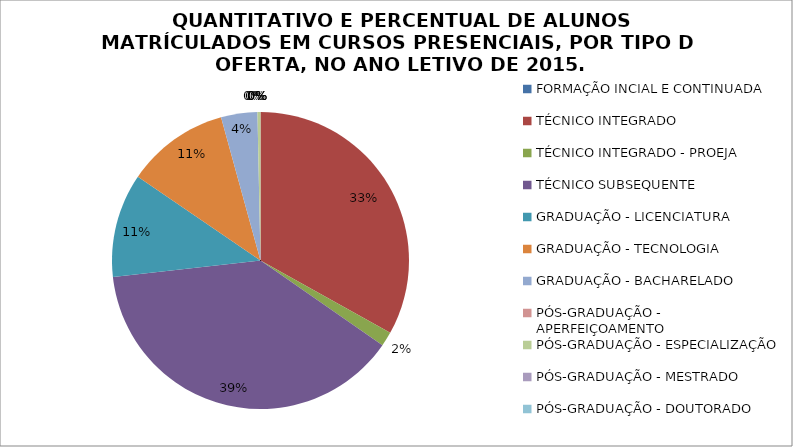
| Category | QUANTITATIVO E PERCENTUAL DE ALUNOS MATRÍCULADOS EM CURSOS PRESENCIAIS, POR TIPO DE OFERTA, NO ANO LETIVO DE 2015. |
|---|---|
| FORMAÇÃO INCIAL E CONTINUADA | 0 |
| TÉCNICO INTEGRADO | 33.099 |
| TÉCNICO INTEGRADO - PROEJA | 1.572 |
| TÉCNICO SUBSEQUENTE | 38.564 |
| GRADUAÇÃO - LICENCIATURA | 11.307 |
| GRADUAÇÃO - TECNOLOGIA | 11.178 |
| GRADUAÇÃO - BACHARELADO | 3.953 |
| PÓS-GRADUAÇÃO - APERFEIÇOAMENTO | 0 |
| PÓS-GRADUAÇÃO - ESPECIALIZAÇÃO | 0.328 |
| PÓS-GRADUAÇÃO - MESTRADO | 0 |
| PÓS-GRADUAÇÃO - DOUTORADO | 0 |